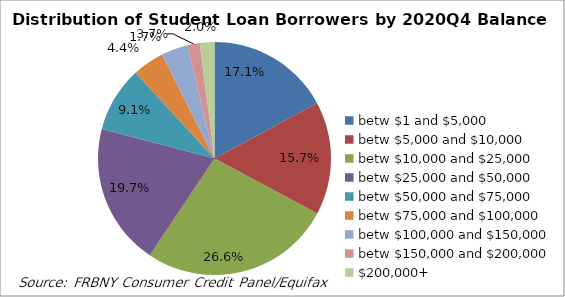
| Category | Series 0 |
|---|---|
| betw $1 and $5,000 | 0.171 |
| betw $5,000 and $10,000 | 0.157 |
| betw $10,000 and $25,000 | 0.266 |
| betw $25,000 and $50,000 | 0.197 |
| betw $50,000 and $75,000 | 0.091 |
| betw $75,000 and $100,000 | 0.044 |
| betw $100,000 and $150,000 | 0.037 |
| betw $150,000 and $200,000 | 0.017 |
| $200,000+ | 0.02 |